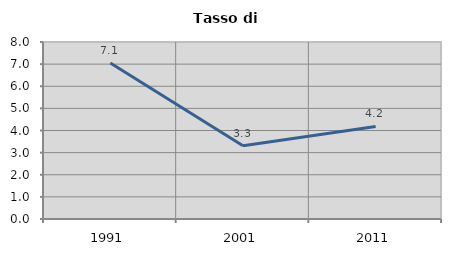
| Category | Tasso di disoccupazione   |
|---|---|
| 1991.0 | 7.051 |
| 2001.0 | 3.309 |
| 2011.0 | 4.184 |